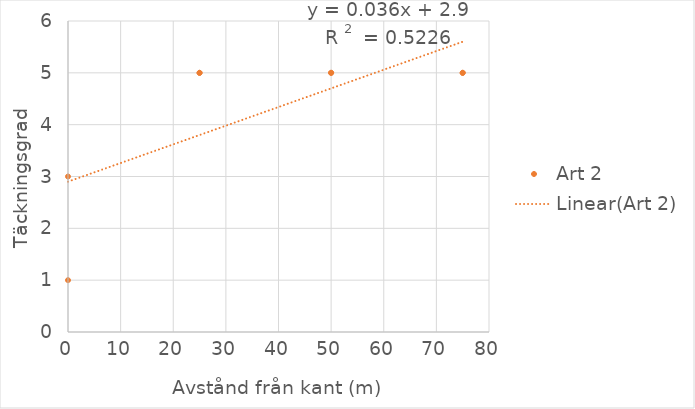
| Category | Art 2 |
|---|---|
| 0.0 | 1 |
| 0.0 | 3 |
| 25.0 | 5 |
| 25.0 | 5 |
| 50.0 | 5 |
| 50.0 | 5 |
| 75.0 | 5 |
| 75.0 | 5 |